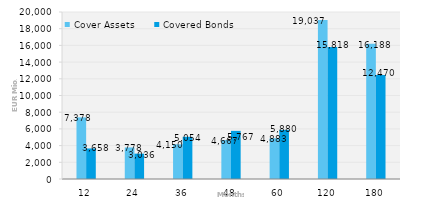
| Category | Cover Assets | Covered Bonds |
|---|---|---|
| 12.0 | 7377.743 | 3658 |
| 24.0 | 3778.16 | 3035.736 |
| 36.0 | 4149.941 | 5054.233 |
| 48.0 | 4667.318 | 5767.142 |
| 60.0 | 4882.808 | 5880.388 |
| 120.0 | 19036.593 | 15818.342 |
| 180.0 | 16188.467 | 12469.534 |